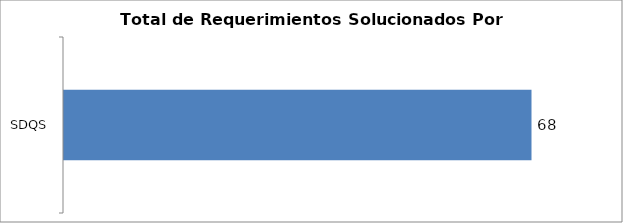
| Category | Total |
|---|---|
| SDQS | 68 |